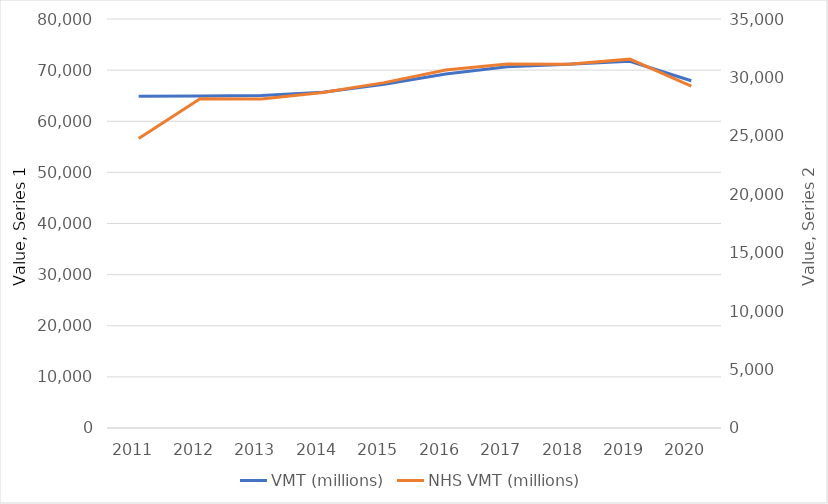
| Category | VMT (millions) |
|---|---|
| 2011.0 | 64914.112 |
| 2012.0 | 64959.172 |
| 2013.0 | 65046.484 |
| 2014.0 | 65666.604 |
| 2015.0 | 67257.005 |
| 2016.0 | 69226.971 |
| 2017.0 | 70677.248 |
| 2018.0 | 71167.207 |
| 2019.0 | 71734.628 |
| 2020.0 | 67921.497 |